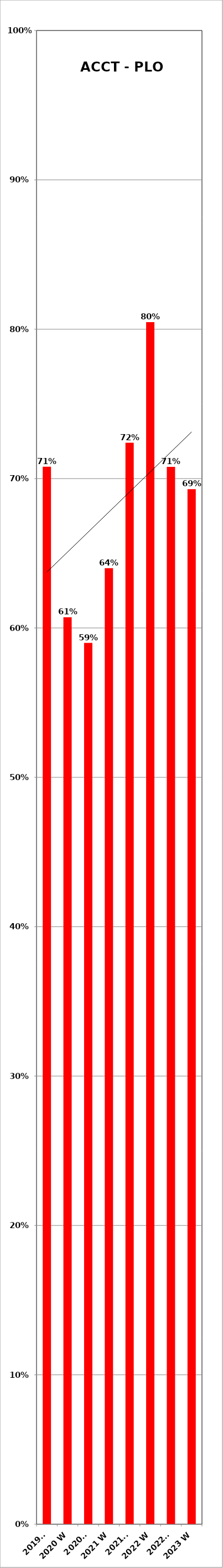
| Category | Series 0 |
|---|---|
| 2019 F | 0.708 |
| 2020 W | 0.607 |
| 2020 F | 0.59 |
| 2021 W | 0.64 |
| 2021 F | 0.724 |
| 2022 W | 0.805 |
| 2022 F | 0.708 |
| 2023 W | 0.693 |